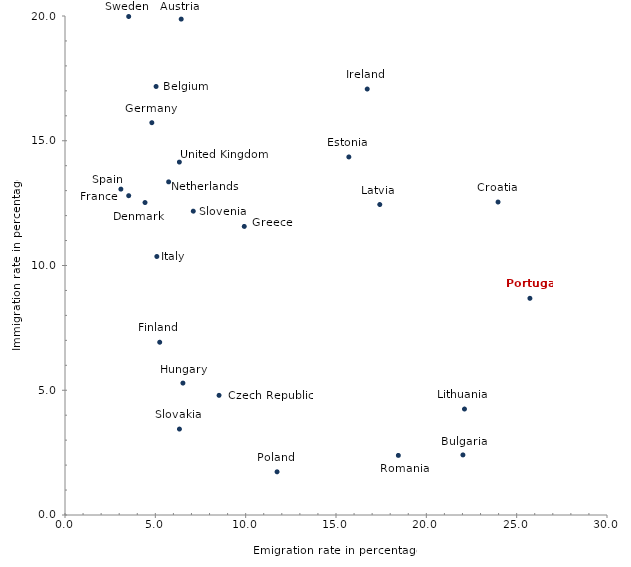
| Category | Series 0 |
|---|---|
| 6.431529199779075 | 19.875 |
| 5.041368093531963 | 17.175 |
| 22.026196983222714 | 2.407 |
| 23.969470528077352 | 12.543 |
| 8.526243616342425 | 4.796 |
| 4.428646769265313 | 12.524 |
| 15.709826439597842 | 14.351 |
| 5.24218767511256 | 6.925 |
| 3.5260918025022305 | 12.797 |
| 4.806447594021077 | 15.724 |
| 9.922771425475165 | 11.566 |
| 6.527072296355924 | 5.287 |
| 16.729090352371074 | 17.073 |
| 5.083027560246622 | 10.361 |
| 17.42342832778198 | 12.444 |
| 22.11251738006622 | 4.248 |
| 5.73636043008388 | 13.352 |
| 11.737257787262633 | 1.731 |
| 25.73353098276024 | 8.685 |
| 18.45017162024414 | 2.389 |
| 6.3346559738816826 | 3.445 |
| 7.100412093595183 | 12.177 |
| 3.0916595530680167 | 13.061 |
| 3.525424856913036 | 19.979 |
| 6.330500683457463 | 14.145 |